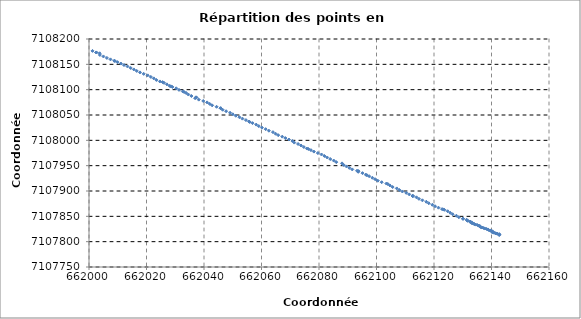
| Category | Series 0 |
|---|---|
| 662142.686 | 7107813.02 |
| 662142.732 | 7107814.023 |
| 662142.685 | 7107814.983 |
| 662142.025 | 7107815.68 |
| 662141.769 | 7107816.103 |
| 662141.615 | 7107816.138 |
| 662141.39 | 7107816.648 |
| 662140.891 | 7107817.518 |
| 662140.566 | 7107818.422 |
| 662140.219 | 7107818.871 |
| 662140.278 | 7107819.406 |
| 662140.312 | 7107820.397 |
| 662140.0 | 7107821.37 |
| 662139.447 | 7107822.206 |
| 662138.955 | 7107823.092 |
| 662138.763 | 7107824.117 |
| 662138.286 | 7107825.054 |
| 662137.685 | 7107825.913 |
| 662137.283 | 7107827.015 |
| 662136.709 | 7107827.877 |
| 662136.201 | 7107828.847 |
| 662135.959 | 7107829.865 |
| 662135.933 | 7107830.86 |
| 662135.568 | 7107831.771 |
| 662135.121 | 7107832.787 |
| 662134.55 | 7107833.681 |
| 662134.052 | 7107834.563 |
| 662133.821 | 7107835.509 |
| 662133.37 | 7107836.312 |
| 662133.037 | 7107836.904 |
| 662133.101 | 7107837.986 |
| 662132.742 | 7107838.801 |
| 662132.686 | 7107839.251 |
| 662132.579 | 7107839.279 |
| 662132.567 | 7107839.587 |
| 662131.769 | 7107840.953 |
| 662131.504 | 7107841.767 |
| 662131.378 | 7107843.27 |
| 662130.093 | 7107844.978 |
| 662130.089 | 7107845.425 |
| 662128.642 | 7107848.2 |
| 662127.796 | 7107851.196 |
| 662126.472 | 7107854.141 |
| 662125.632 | 7107857.049 |
| 662124.752 | 7107860.069 |
| 662123.608 | 7107862.866 |
| 662123.211 | 7107863.616 |
| 662122.819 | 7107864.25 |
| 662121.552 | 7107867.058 |
| 662120.369 | 7107869.847 |
| 662119.423 | 7107872.784 |
| 662118.176 | 7107875.809 |
| 662117.309 | 7107878.767 |
| 662115.969 | 7107881.603 |
| 662114.758 | 7107884.521 |
| 662113.9 | 7107887.542 |
| 662112.642 | 7107890.14 |
| 662112.611 | 7107890.16 |
| 662112.634 | 7107890.165 |
| 662111.41 | 7107893.258 |
| 662110.336 | 7107896.334 |
| 662108.989 | 7107899.085 |
| 662107.948 | 7107902.012 |
| 662107.052 | 7107905.091 |
| 662105.615 | 7107907.86 |
| 662104.679 | 7107910.94 |
| 662103.919 | 7107913.815 |
| 662103.44 | 7107914.654 |
| 662101.811 | 7107917.341 |
| 662100.455 | 7107920.299 |
| 662099.542 | 7107923.165 |
| 662098.561 | 7107926.143 |
| 662097.45 | 7107929.228 |
| 662096.642 | 7107931.167 |
| 662096.29 | 7107932.233 |
| 662095.126 | 7107935.269 |
| 662093.651 | 7107937.913 |
| 662093.755 | 7107939.258 |
| 662093.223 | 7107939.994 |
| 662091.561 | 7107942.618 |
| 662090.546 | 7107945.624 |
| 662089.538 | 7107948.538 |
| 662088.536 | 7107951.476 |
| 662088.009 | 7107954.529 |
| 662086.012 | 7107956.968 |
| 662085.118 | 7107960.075 |
| 662083.923 | 7107963.082 |
| 662082.859 | 7107966.14 |
| 662081.891 | 7107969.135 |
| 662080.873 | 7107972.07 |
| 662079.601 | 7107974.867 |
| 662078.223 | 7107977.769 |
| 662077.185 | 7107980.615 |
| 662076.304 | 7107982.902 |
| 662075.794 | 7107983.809 |
| 662074.719 | 7107986.782 |
| 662073.74 | 7107989.836 |
| 662072.716 | 7107992.767 |
| 662071.405 | 7107995.547 |
| 662070.741 | 7107998.681 |
| 662069.554 | 7108001.61 |
| 662068.322 | 7108004.414 |
| 662067.224 | 7108007.235 |
| 662065.818 | 7108010.08 |
| 662064.893 | 7108013.023 |
| 662063.983 | 7108016.133 |
| 662062.573 | 7108019.033 |
| 662061.454 | 7108022.05 |
| 662060.153 | 7108025.07 |
| 662059.069 | 7108028.038 |
| 662058.149 | 7108031.094 |
| 662056.879 | 7108033.935 |
| 662055.876 | 7108036.276 |
| 662055.647 | 7108037.08 |
| 662054.577 | 7108039.939 |
| 662053.353 | 7108042.816 |
| 662052.313 | 7108045.682 |
| 662051.052 | 7108048.523 |
| 662050.022 | 7108051.366 |
| 662049.05 | 7108054.463 |
| 662047.687 | 7108057.443 |
| 662046.477 | 7108060.367 |
| 662045.762 | 7108063.362 |
| 662045.793 | 7108063.372 |
| 662044.379 | 7108066.195 |
| 662042.835 | 7108069.006 |
| 662041.979 | 7108071.938 |
| 662041.071 | 7108074.869 |
| 662039.744 | 7108077.661 |
| 662038.179 | 7108080.335 |
| 662036.918 | 7108083.085 |
| 662037.37 | 7108084.62 |
| 662037.221 | 7108084.89 |
| 662035.628 | 7108087.486 |
| 662034.55 | 7108090.406 |
| 662033.778 | 7108093.521 |
| 662033.085 | 7108095.35 |
| 662032.604 | 7108096.579 |
| 662031.306 | 7108099.58 |
| 662030.339 | 7108102.683 |
| 662029.005 | 7108105.41 |
| 662028.445 | 7108106.569 |
| 662028.059 | 7108107.439 |
| 662027.095 | 7108110.464 |
| 662026.104 | 7108113.471 |
| 662025.586 | 7108114.941 |
| 662024.649 | 7108116.24 |
| 662023.434 | 7108119.153 |
| 662022.536 | 7108122.285 |
| 662021.508 | 7108125.183 |
| 662020.402 | 7108128.226 |
| 662019.025 | 7108131.215 |
| 662017.731 | 7108134.096 |
| 662016.596 | 7108136.985 |
| 662015.59 | 7108139.926 |
| 662014.501 | 7108142.846 |
| 662013.394 | 7108145.759 |
| 662012.167 | 7108148.626 |
| 662011.101 | 7108151.534 |
| 662009.902 | 7108154.354 |
| 662008.99 | 7108156.589 |
| 662008.774 | 7108157.063 |
| 662007.464 | 7108159.787 |
| 662006.222 | 7108162.703 |
| 662005.017 | 7108165.594 |
| 662003.782 | 7108168.575 |
| 662003.7 | 7108171.799 |
| 662002.549 | 7108173.326 |
| 662002.516 | 7108173.484 |
| 662001.222 | 7108176.488 |